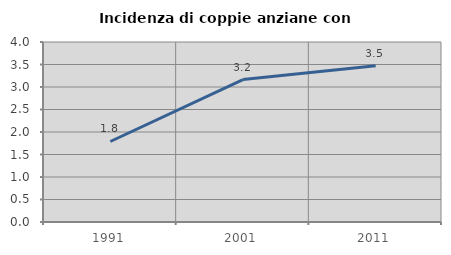
| Category | Incidenza di coppie anziane con figli |
|---|---|
| 1991.0 | 1.789 |
| 2001.0 | 3.165 |
| 2011.0 | 3.47 |